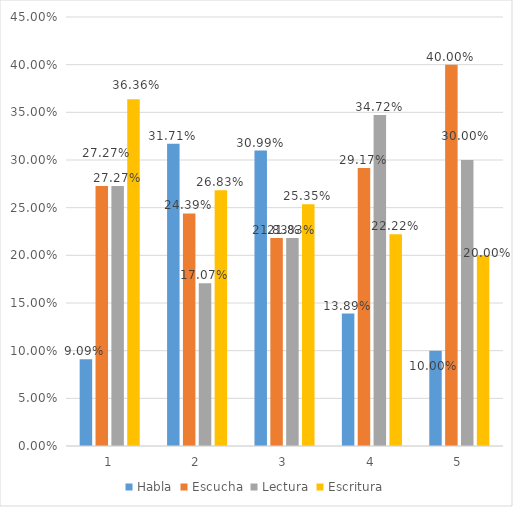
| Category | Habla | Escucha | Lectura | Escritura |
|---|---|---|---|---|
| 0 | 0.091 | 0.273 | 0.273 | 0.364 |
| 1 | 0.317 | 0.244 | 0.171 | 0.268 |
| 2 | 0.31 | 0.218 | 0.218 | 0.254 |
| 3 | 0.139 | 0.292 | 0.347 | 0.222 |
| 4 | 0.1 | 0.4 | 0.3 | 0.2 |